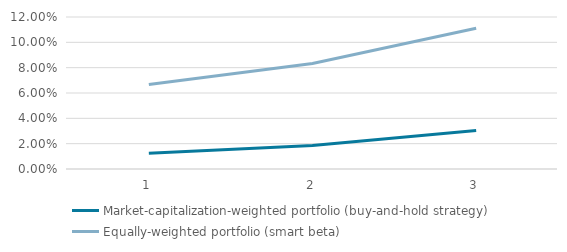
| Category | Market-capitalization-weighted portfolio (buy-and-hold strategy) | Equally-weighted portfolio (smart beta) |
|---|---|---|
| 0 | 0.012 | 0.067 |
| 1 | 0.019 | 0.083 |
| 2 | 0.03 | 0.111 |